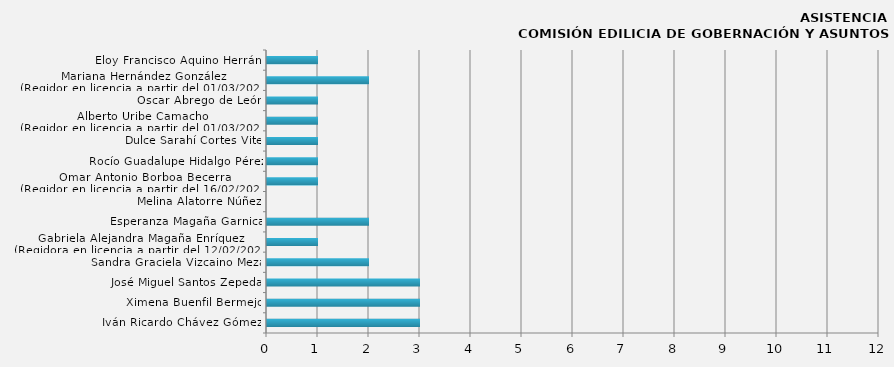
| Category | Iván Ricardo Chávez Gómez  |
|---|---|
| Iván Ricardo Chávez Gómez  | 3 |
| Ximena Buenfil Bermejo | 3 |
| José Miguel Santos Zepeda | 3 |
| Sandra Graciela Vizcaino Meza | 2 |
| Gabriela Alejandra Magaña Enríquez
(Regidora en licencia a partir del 12/02/2024) | 1 |
| Esperanza Magaña Garnica | 2 |
| Melina Alatorre Núñez | 0 |
| Omar Antonio Borboa Becerra
(Regidor en licencia a partir del 16/02/2024) | 1 |
| Rocío Guadalupe Hidalgo Pérez | 1 |
| Dulce Sarahí Cortes Vite | 1 |
| Alberto Uribe Camacho
(Regidor en licencia a partir del 01/03/2024) | 1 |
| Oscar Abrego de León | 1 |
| Mariana Hernández González
(Regidor en licencia a partir del 01/03/2024) | 2 |
| Eloy Francisco Aquino Herrán  | 1 |